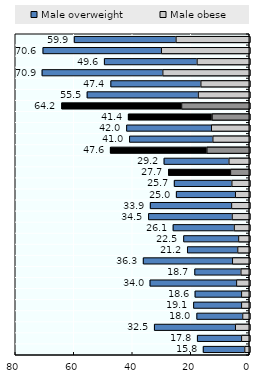
| Category | Male overweight | Male obese |
|---|---|---|
| Fiji | 59.9 | 25.1 |
| New Zealand | 70.6 | 30.1 |
| Solomon Islands | 49.6 | 17.9 |
| Australia | 70.9 | 29.6 |
| Papua New Guinea | 47.4 | 16.6 |
| Mongolia | 55.5 | 17.5 |
| OECD | 64.191 | 23.166 |
| Asia Pacific-UM | 41.4 | 12.75 |
| Malaysia | 42 | 13 |
| Brunei Darussalam | 41 | 12.5 |
| Asia Pacific-H | 47.55 | 14.533 |
| Thailand | 29.2 | 7 |
| Asia Pacific-LM/L | 27.66 | 6.447 |
| Pakistan | 25.7 | 6 |
| Indonesia | 25 | 4.8 |
| Korea, DPR | 33.9 | 6.1 |
| China | 34.5 | 5.9 |
| Philippines | 26.1 | 5.2 |
| Lao PDR | 22.5 | 3.7 |
| Myanmar | 21.2 | 4 |
| Singapore | 36.3 | 5.8 |
| Sri Lanka | 18.7 | 2.9 |
| Korea, Rep. | 34 | 4.4 |
| Cambodia | 18.6 | 2.7 |
| Nepal | 19.1 | 2.7 |
| Bangladesh | 18 | 2.3 |
| Japan | 32.5 | 4.8 |
| India | 17.8 | 2.7 |
| Viet Nam | 15.8 | 1.6 |